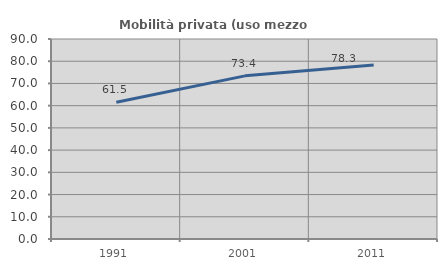
| Category | Mobilità privata (uso mezzo privato) |
|---|---|
| 1991.0 | 61.516 |
| 2001.0 | 73.419 |
| 2011.0 | 78.276 |